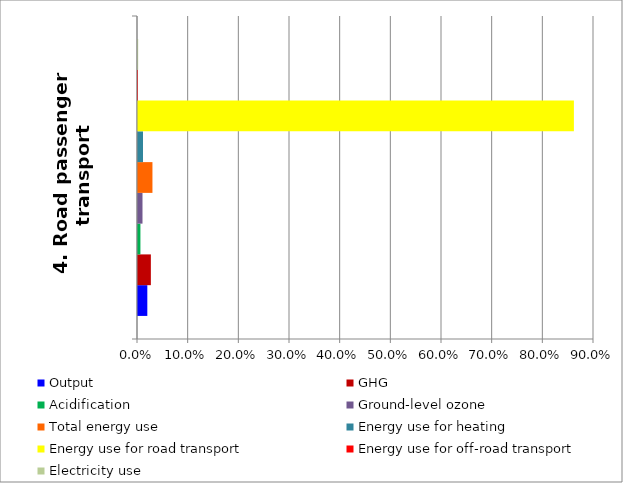
| Category | Output | GHG | Acidification | Ground-level ozone | Total energy use | Energy use for heating | Energy use for road transport | Energy use for off-road transport | Electricity use |
|---|---|---|---|---|---|---|---|---|---|
| 4. Road passenger transport | 0.018 | 0.025 | 0.005 | 0.009 | 0.029 | 0.01 | 0.86 | 0 | 0 |